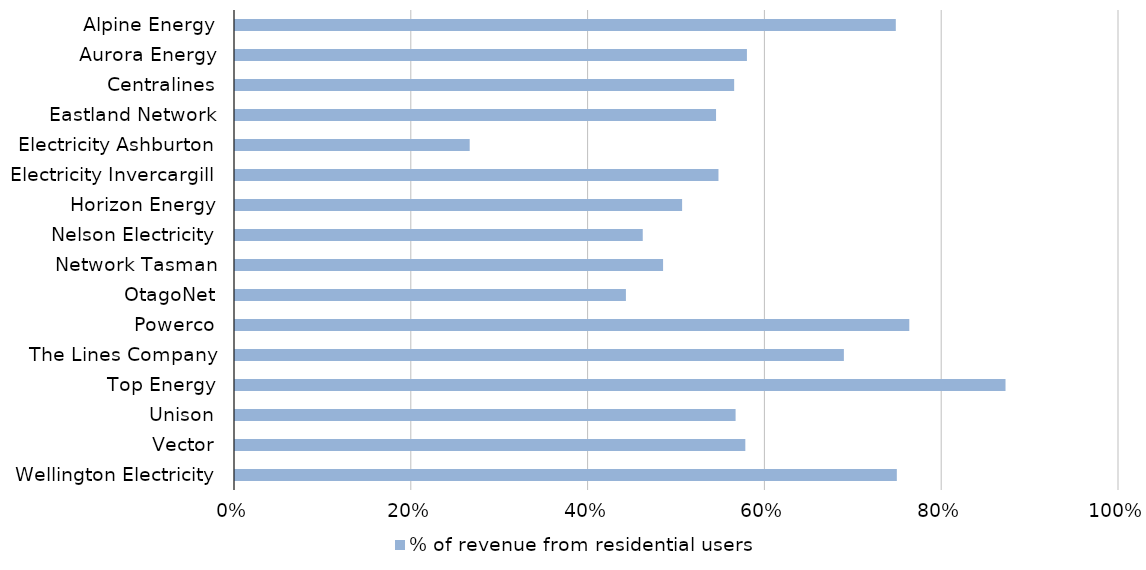
| Category | % of revenue from residential users |
|---|---|
| Alpine Energy | 0.748 |
| Aurora Energy | 0.579 |
| Centralines | 0.565 |
| Eastland Network | 0.544 |
| Electricity Ashburton | 0.265 |
| Electricity Invercargill | 0.547 |
| Horizon Energy | 0.506 |
| Nelson Electricity | 0.461 |
| Network Tasman | 0.484 |
| OtagoNet | 0.442 |
| Powerco | 0.763 |
| The Lines Company | 0.689 |
| Top Energy | 0.872 |
| Unison | 0.566 |
| Vector | 0.577 |
| Wellington Electricity | 0.749 |